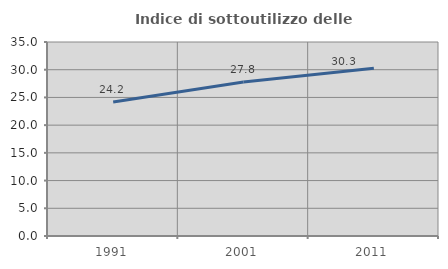
| Category | Indice di sottoutilizzo delle abitazioni  |
|---|---|
| 1991.0 | 24.19 |
| 2001.0 | 27.801 |
| 2011.0 | 30.269 |